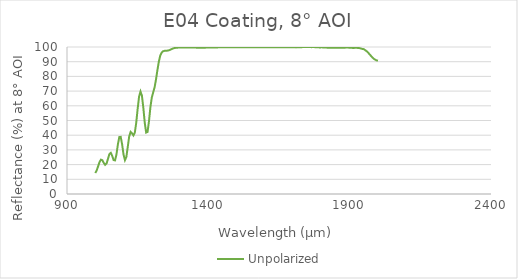
| Category | Unpolarized |
|---|---|
| 1000.0 | 14.281 |
| 1004.9999999999999 | 16.019 |
| 1010.0 | 18.793 |
| 1014.9999999999999 | 21.679 |
| 1020.0 | 23.359 |
| 1024.9999999999998 | 23.007 |
| 1030.0 | 21.174 |
| 1034.9999999999998 | 19.802 |
| 1040.0 | 20.744 |
| 1045.0 | 23.924 |
| 1050.0 | 27.178 |
| 1055.0 | 28.004 |
| 1060.0 | 25.909 |
| 1065.0 | 23.074 |
| 1070.0 | 22.85 |
| 1075.0 | 26.991 |
| 1080.0 | 33.657 |
| 1085.0 | 38.726 |
| 1090.0000000000002 | 38.859 |
| 1095.0 | 33.775 |
| 1100.0000000000002 | 26.89 |
| 1105.0 | 23.032 |
| 1110.0000000000002 | 25.18 |
| 1115.0 | 32.104 |
| 1120.0000000000002 | 39.131 |
| 1125.0 | 42.221 |
| 1129.9999999999998 | 41.289 |
| 1135.0 | 39.816 |
| 1139.9999999999998 | 41.796 |
| 1145.0 | 48.565 |
| 1149.9999999999998 | 58.06 |
| 1155.0 | 66.248 |
| 1159.9999999999998 | 69.708 |
| 1165.0 | 66.953 |
| 1170.0 | 58.77 |
| 1175.0 | 48.59 |
| 1180.0 | 41.795 |
| 1185.0 | 42.223 |
| 1190.0 | 49.455 |
| 1195.0 | 58.927 |
| 1200.0 | 65.636 |
| 1205.0 | 69.183 |
| 1210.0 | 72.701 |
| 1215.0000000000002 | 78.062 |
| 1220.0 | 84.44 |
| 1225.0000000000002 | 90.192 |
| 1230.0 | 94.176 |
| 1235.0000000000002 | 96.25 |
| 1240.0 | 97.102 |
| 1245.0000000000002 | 97.382 |
| 1250.0 | 97.452 |
| 1254.9999999999998 | 97.516 |
| 1260.0 | 97.714 |
| 1264.9999999999998 | 98.092 |
| 1270.0 | 98.556 |
| 1274.9999999999998 | 98.986 |
| 1280.0 | 99.296 |
| 1285.0 | 99.446 |
| 1290.0 | 99.542 |
| 1295.0 | 99.605 |
| 1300.0 | 99.614 |
| 1305.0 | 99.608 |
| 1310.0 | 99.599 |
| 1315.0 | 99.595 |
| 1320.0 | 99.615 |
| 1325.0 | 99.642 |
| 1330.0 | 99.669 |
| 1335.0 | 99.694 |
| 1340.0 | 99.714 |
| 1345.0 | 99.695 |
| 1350.0 | 99.657 |
| 1355.0 | 99.598 |
| 1360.0 | 99.531 |
| 1365.0 | 99.511 |
| 1370.0 | 99.531 |
| 1375.0 | 99.554 |
| 1380.0 | 99.567 |
| 1385.0 | 99.564 |
| 1390.0 | 99.572 |
| 1395.0 | 99.597 |
| 1400.0 | 99.628 |
| 1405.0 | 99.639 |
| 1410.0 | 99.637 |
| 1415.0 | 99.662 |
| 1420.0 | 99.705 |
| 1425.0 | 99.729 |
| 1430.0 | 99.728 |
| 1435.0 | 99.745 |
| 1440.0 | 99.768 |
| 1445.0 | 99.785 |
| 1450.0 | 99.779 |
| 1455.0 | 99.784 |
| 1460.0 | 99.805 |
| 1465.0 | 99.804 |
| 1470.0 | 99.799 |
| 1475.0 | 99.817 |
| 1480.0 | 99.816 |
| 1485.0 | 99.831 |
| 1490.0 | 99.848 |
| 1495.0 | 99.853 |
| 1500.0 | 99.839 |
| 1505.0 | 99.839 |
| 1510.0 | 99.841 |
| 1515.0 | 99.854 |
| 1520.0 | 99.853 |
| 1525.0 | 99.844 |
| 1530.0 | 99.847 |
| 1535.0 | 99.838 |
| 1540.0 | 99.841 |
| 1545.0 | 99.835 |
| 1550.0 | 99.848 |
| 1555.0 | 99.832 |
| 1560.0 | 99.829 |
| 1565.0 | 99.838 |
| 1570.0 | 99.832 |
| 1575.0 | 99.834 |
| 1580.0 | 99.818 |
| 1585.0 | 99.814 |
| 1590.0 | 99.833 |
| 1595.0 | 99.824 |
| 1600.0 | 99.822 |
| 1605.0 | 99.829 |
| 1610.0 | 99.835 |
| 1615.0 | 99.843 |
| 1620.0 | 99.832 |
| 1625.0 | 99.846 |
| 1630.0 | 99.826 |
| 1635.0 | 99.811 |
| 1640.0 | 99.837 |
| 1645.0 | 99.859 |
| 1650.0 | 99.86 |
| 1655.0 | 99.844 |
| 1660.0 | 99.771 |
| 1665.0 | 99.813 |
| 1670.0 | 99.813 |
| 1675.0 | 99.795 |
| 1680.0 | 99.804 |
| 1685.0 | 99.778 |
| 1690.0 | 99.806 |
| 1695.0 | 99.814 |
| 1700.0 | 99.814 |
| 1705.0 | 99.807 |
| 1710.0 | 99.739 |
| 1715.0 | 99.763 |
| 1720.0 | 99.866 |
| 1725.0 | 99.913 |
| 1730.0 | 99.909 |
| 1735.0 | 99.922 |
| 1740.0 | 99.947 |
| 1745.0 | 99.933 |
| 1750.0 | 99.959 |
| 1755.0 | 99.997 |
| 1760.0 | 99.973 |
| 1765.0 | 99.9 |
| 1770.0 | 99.952 |
| 1775.0 | 99.93 |
| 1780.0 | 99.834 |
| 1785.0 | 99.806 |
| 1790.0 | 99.774 |
| 1795.0 | 99.689 |
| 1800.0 | 99.762 |
| 1805.0 | 99.731 |
| 1810.0 | 99.685 |
| 1815.0 | 99.638 |
| 1820.0 | 99.556 |
| 1825.0 | 99.564 |
| 1830.0 | 99.522 |
| 1835.0 | 99.454 |
| 1840.0 | 99.476 |
| 1845.0 | 99.475 |
| 1850.0 | 99.47 |
| 1855.0 | 99.441 |
| 1860.0 | 99.566 |
| 1865.0 | 99.565 |
| 1870.0 | 99.492 |
| 1875.0 | 99.506 |
| 1880.0 | 99.554 |
| 1885.0 | 99.569 |
| 1890.0 | 99.632 |
| 1895.0 | 99.59 |
| 1900.0 | 99.519 |
| 1905.0 | 99.569 |
| 1910.0 | 99.368 |
| 1915.0 | 99.339 |
| 1920.0 | 99.486 |
| 1925.0 | 99.453 |
| 1930.0 | 99.333 |
| 1935.0 | 99.227 |
| 1940.0 | 98.947 |
| 1945.0 | 98.696 |
| 1950.0 | 98.523 |
| 1955.0 | 97.851 |
| 1960.0 | 97.143 |
| 1965.0 | 96.259 |
| 1970.0 | 95.119 |
| 1975.0 | 94.041 |
| 1980.0 | 92.945 |
| 1985.0 | 92.013 |
| 1990.0 | 91.418 |
| 1995.0 | 90.931 |
| 2000.0 | 90.66 |